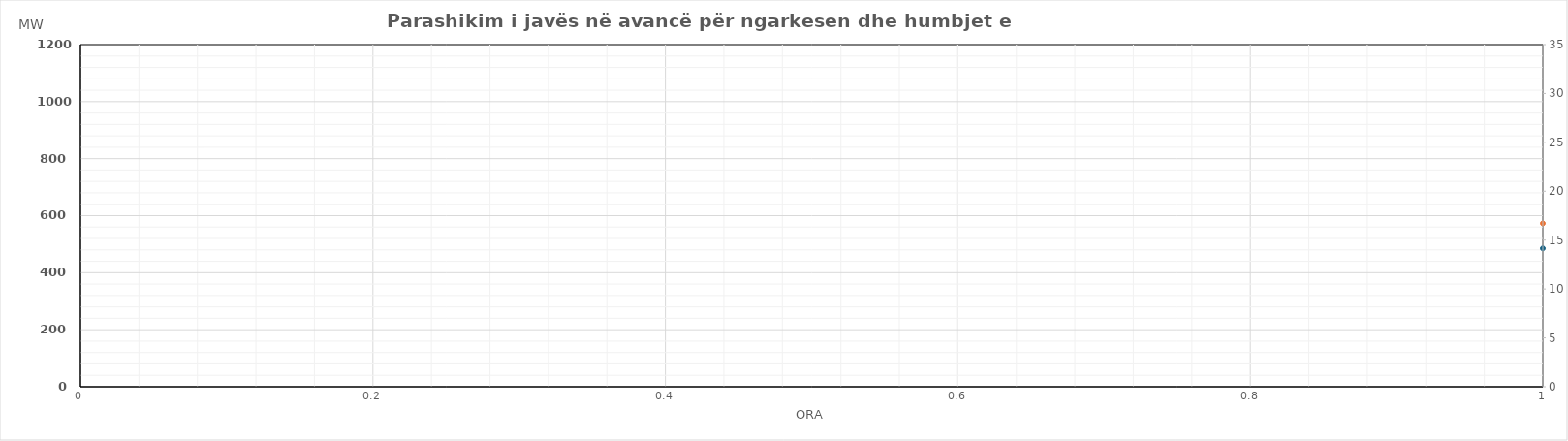
| Category | Ngarkesa (MWh) |
|---|---|
| 0 | 572.96 |
| 1 | 524.04 |
| 2 | 499.64 |
| 3 | 503.95 |
| 4 | 550.67 |
| 5 | 581.06 |
| 6 | 691.85 |
| 7 | 831.2 |
| 8 | 865.6 |
| 9 | 844.6 |
| 10 | 819.26 |
| 11 | 800.35 |
| 12 | 795.88 |
| 13 | 802.85 |
| 14 | 812.65 |
| 15 | 769.35 |
| 16 | 732.88 |
| 17 | 772.78 |
| 18 | 820.68 |
| 19 | 886.97 |
| 20 | 930.43 |
| 21 | 873.54 |
| 22 | 763.67 |
| 23 | 655.92 |
| 24 | 565.87 |
| 25 | 525.52 |
| 26 | 500.72 |
| 27 | 493.29 |
| 28 | 536.22 |
| 29 | 574.43 |
| 30 | 680.55 |
| 31 | 813.2 |
| 32 | 852.29 |
| 33 | 843.25 |
| 34 | 816.97 |
| 35 | 797.75 |
| 36 | 777.21 |
| 37 | 836.5 |
| 38 | 851.35 |
| 39 | 845.89 |
| 40 | 809.51 |
| 41 | 840.07 |
| 42 | 844.45 |
| 43 | 892.7 |
| 44 | 952.45 |
| 45 | 895.84 |
| 46 | 788.18 |
| 47 | 671.24 |
| 48 | 578.65 |
| 49 | 536.44 |
| 50 | 499.09 |
| 51 | 485.31 |
| 52 | 532.41 |
| 53 | 577.03 |
| 54 | 701.64 |
| 55 | 832.26 |
| 56 | 868.81 |
| 57 | 818.89 |
| 58 | 793.35 |
| 59 | 778.39 |
| 60 | 789.37 |
| 61 | 790.68 |
| 62 | 784.7 |
| 63 | 795.31 |
| 64 | 764.85 |
| 65 | 790.51 |
| 66 | 823.51 |
| 67 | 885.03 |
| 68 | 943.14 |
| 69 | 887.95 |
| 70 | 790.31 |
| 71 | 665.74 |
| 72 | 585.64 |
| 73 | 534.23 |
| 74 | 499.67 |
| 75 | 486.25 |
| 76 | 531.45 |
| 77 | 575.59 |
| 78 | 691.39 |
| 79 | 825.03 |
| 80 | 854.55 |
| 81 | 833.39 |
| 82 | 803.26 |
| 83 | 842.41 |
| 84 | 841.19 |
| 85 | 845.81 |
| 86 | 848.89 |
| 87 | 829.42 |
| 88 | 786.81 |
| 89 | 828.17 |
| 90 | 852.71 |
| 91 | 909.42 |
| 92 | 974.15 |
| 93 | 923.83 |
| 94 | 822.47 |
| 95 | 698.71 |
| 96 | 575.04 |
| 97 | 514.56 |
| 98 | 490.57 |
| 99 | 495.58 |
| 100 | 524.59 |
| 101 | 566.09 |
| 102 | 682.09 |
| 103 | 816.33 |
| 104 | 864.87 |
| 105 | 844.2 |
| 106 | 809.16 |
| 107 | 793.11 |
| 108 | 780.53 |
| 109 | 788.12 |
| 110 | 795.99 |
| 111 | 776.42 |
| 112 | 743 |
| 113 | 781.66 |
| 114 | 844.73 |
| 115 | 900.93 |
| 116 | 965.78 |
| 117 | 914.08 |
| 118 | 809.17 |
| 119 | 685.66 |
| 120 | 608.74 |
| 121 | 560.84 |
| 122 | 539.57 |
| 123 | 530.47 |
| 124 | 538.26 |
| 125 | 572.26 |
| 126 | 654.38 |
| 127 | 775.48 |
| 128 | 832.34 |
| 129 | 816.29 |
| 130 | 807.72 |
| 131 | 775.03 |
| 132 | 784.51 |
| 133 | 784.27 |
| 134 | 771.41 |
| 135 | 773 |
| 136 | 745.27 |
| 137 | 783.91 |
| 138 | 823.67 |
| 139 | 882.25 |
| 140 | 932.56 |
| 141 | 871.27 |
| 142 | 763.97 |
| 143 | 646.75 |
| 144 | 607.54 |
| 145 | 553.76 |
| 146 | 520.74 |
| 147 | 517.82 |
| 148 | 519.25 |
| 149 | 531.46 |
| 150 | 601.94 |
| 151 | 696.88 |
| 152 | 762 |
| 153 | 783.41 |
| 154 | 773.59 |
| 155 | 762.85 |
| 156 | 759.56 |
| 157 | 751.77 |
| 158 | 752.93 |
| 159 | 708.85 |
| 160 | 678.23 |
| 161 | 717.02 |
| 162 | 769.25 |
| 163 | 844.46 |
| 164 | 921.69 |
| 165 | 867.57 |
| 166 | 760.38 |
| 167 | 638.79 |